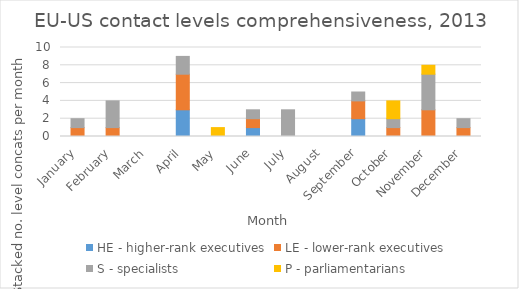
| Category | HE - higher-rank executives | LE - lower-rank executives | S - specialists | P - parliamentarians |
|---|---|---|---|---|
| January | 0 | 1 | 1 | 0 |
| February | 0 | 1 | 3 | 0 |
| March | 0 | 0 | 0 | 0 |
| April | 3 | 4 | 2 | 0 |
| May | 0 | 0 | 0 | 1 |
| June | 1 | 1 | 1 | 0 |
| July | 0 | 0 | 3 | 0 |
| August | 0 | 0 | 0 | 0 |
| September | 2 | 2 | 1 | 0 |
| October | 0 | 1 | 1 | 2 |
| November | 0 | 3 | 4 | 1 |
| December | 0 | 1 | 1 | 0 |